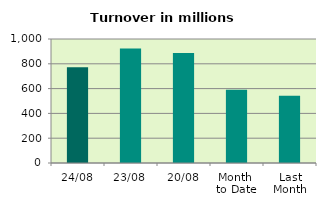
| Category | Series 0 |
|---|---|
| 24/08 | 771.285 |
| 23/08 | 922.483 |
| 20/08 | 886.765 |
| Month 
to Date | 591.488 |
| Last
Month | 542.77 |